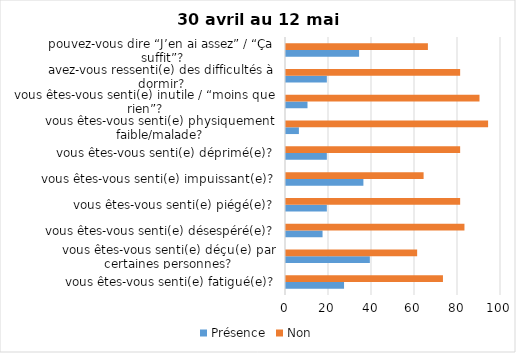
| Category | Présence | Non |
|---|---|---|
| vous êtes-vous senti(e) fatigué(e)? | 27 | 73 |
| vous êtes-vous senti(e) déçu(e) par certaines personnes? | 39 | 61 |
| vous êtes-vous senti(e) désespéré(e)? | 17 | 83 |
| vous êtes-vous senti(e) piégé(e)? | 19 | 81 |
| vous êtes-vous senti(e) impuissant(e)? | 36 | 64 |
| vous êtes-vous senti(e) déprimé(e)? | 19 | 81 |
| vous êtes-vous senti(e) physiquement faible/malade? | 6 | 94 |
| vous êtes-vous senti(e) inutile / “moins que rien”? | 10 | 90 |
| avez-vous ressenti(e) des difficultés à dormir? | 19 | 81 |
| pouvez-vous dire “J’en ai assez” / “Ça suffit”? | 34 | 66 |